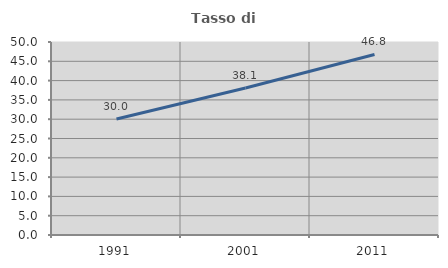
| Category | Tasso di occupazione   |
|---|---|
| 1991.0 | 30.041 |
| 2001.0 | 38.075 |
| 2011.0 | 46.765 |